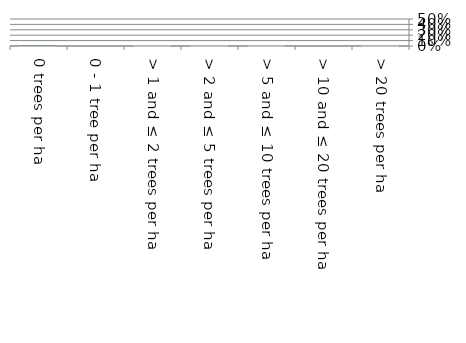
| Category | Near native & fragments |
|---|---|
| 0 trees per ha | 0.019 |
| 0 - 1 tree per ha | 0 |
| > 1 and ≤ 2 trees per ha | 0 |
| > 2 and ≤ 5 trees per ha | 0 |
| > 5 and ≤ 10 trees per ha | 0 |
| > 10 and ≤ 20 trees per ha | 0 |
| > 20 trees per ha | 0 |